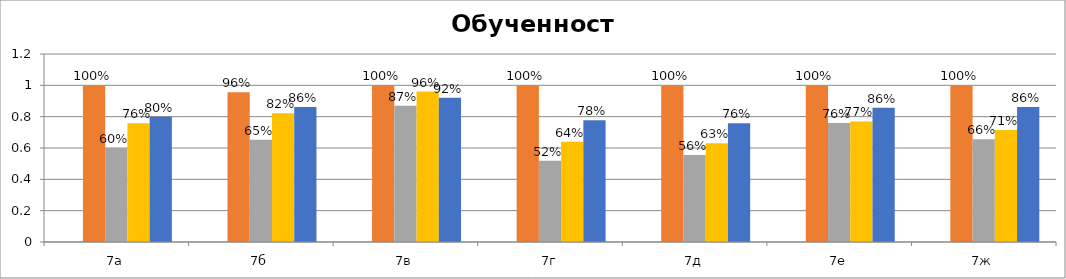
| Category | Series 0 | Series 1 | Series 2 | Series 3 | Series 4 |
|---|---|---|---|---|---|
| 7а |  | 1 | 0.6 | 0.759 | 0.8 |
| 7б |  | 0.957 | 0.652 | 0.821 | 0.862 |
| 7в |  | 1 | 0.87 | 0.96 | 0.92 |
| 7г |  | 1 | 0.519 | 0.64 | 0.778 |
| 7д |  | 1 | 0.556 | 0.63 | 0.759 |
| 7е |  | 1 | 0.76 | 0.769 | 0.857 |
| 7ж |  | 1 | 0.655 | 0.714 | 0.862 |